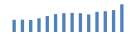
| Category | Exportações (1) |
|---|---|
| 0 | 203692.629 |
| 1 | 204985.899 |
| 2 | 199789.293 |
| 3 | 228223.553 |
| 4 | 265930.688 |
| 5 | 297441.741 |
| 6 | 313195.508 |
| 7 | 319331.634 |
| 8 | 313646.514 |
| 9 | 292708.824 |
| 10 | 335676.548 |
| 11 | 346139.442 |
| 12 | 364472.386 |
| 13 | 462235.534 |